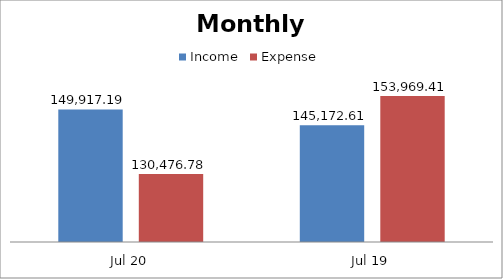
| Category | Income | Expense |
|---|---|---|
| Jul 20 | 149917.19 | 130476.78 |
| Jul 19 | 145172.61 | 153969.41 |